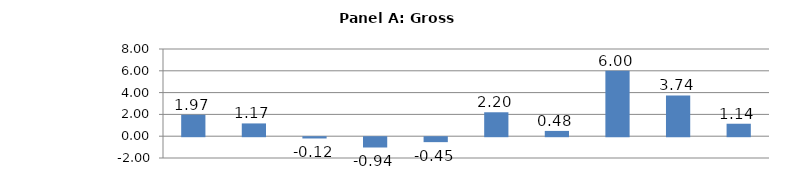
| Category | Series 0 |
|---|---|
| Crop and animal production | 1.965 |
| Wood product manufacturing | 1.172 |
| Forestry and logging | -0.117 |
| Fishing, hunting and trapping | -0.945 |
| Paper manufacturing | -0.453 |
| Support activities for agriculture and forestry | 2.195 |
| Mining (except oil and gas) | 0.485 |
| Support activities for mining and oil and gas | 5.996 |
| Oil and gas extraction | 3.743 |
| Petroleum and coal products manufacturing | 1.144 |